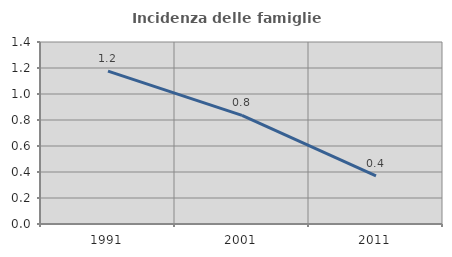
| Category | Incidenza delle famiglie numerose |
|---|---|
| 1991.0 | 1.176 |
| 2001.0 | 0.835 |
| 2011.0 | 0.371 |